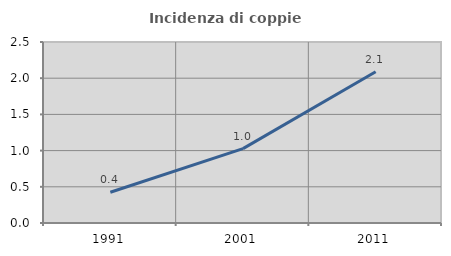
| Category | Incidenza di coppie miste |
|---|---|
| 1991.0 | 0.425 |
| 2001.0 | 1.028 |
| 2011.0 | 2.09 |